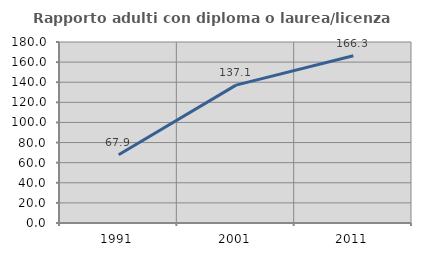
| Category | Rapporto adulti con diploma o laurea/licenza media  |
|---|---|
| 1991.0 | 67.925 |
| 2001.0 | 137.097 |
| 2011.0 | 166.25 |